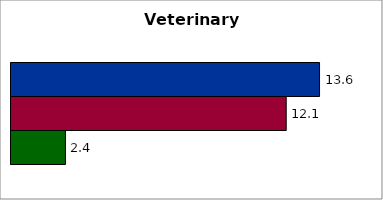
| Category | 50 states and D.C. | SREB states | State |
|---|---|---|---|
| 0 | 13.6 | 12.131 | 2.4 |